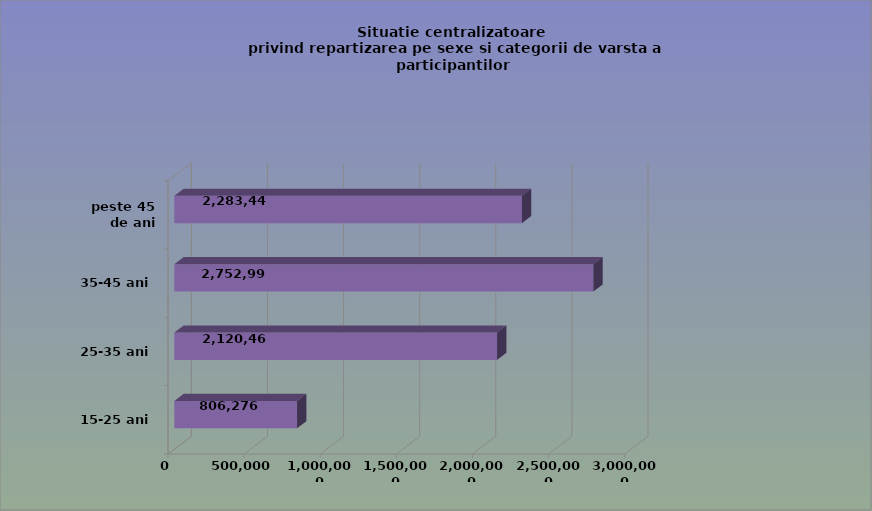
| Category | 15-25 ani 25-35 ani 35-45 ani peste 45 de ani |
|---|---|
| 15-25 ani | 806276 |
| 25-35 ani | 2120466 |
| 35-45 ani | 2752993 |
| peste 45 de ani | 2283440 |